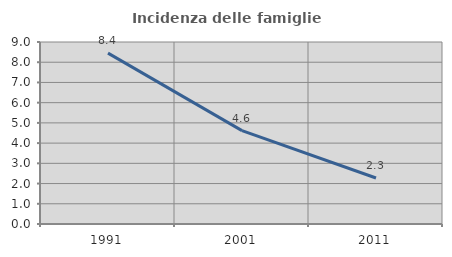
| Category | Incidenza delle famiglie numerose |
|---|---|
| 1991.0 | 8.448 |
| 2001.0 | 4.617 |
| 2011.0 | 2.273 |